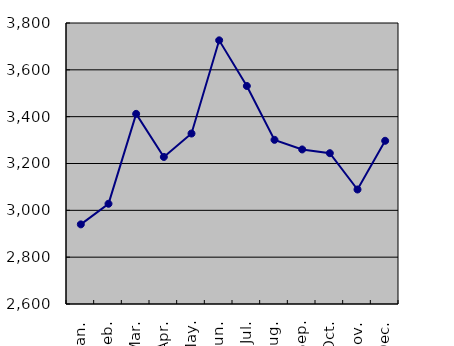
| Category | Series 0 |
|---|---|
| Jan. | 2940 |
| Feb. | 3028 |
| Mar. | 3412 |
| Apr. | 3228 |
| May. | 3328 |
| Jun. | 3726 |
| Jul. | 3531 |
| Aug. | 3301 |
| Sep. | 3260 |
| Oct. | 3244 |
| Nov. | 3089 |
| Dec. | 3297 |